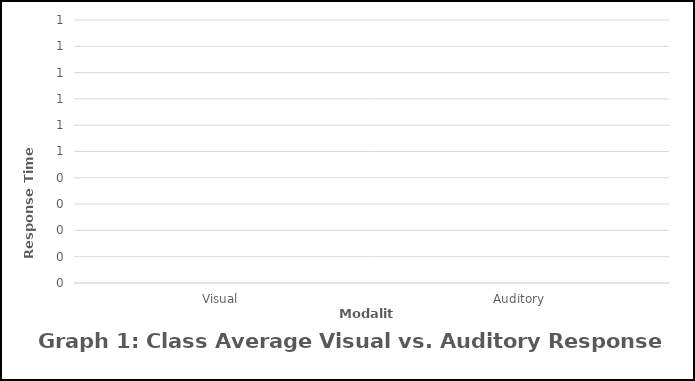
| Category | Series 0 |
|---|---|
| Visual | 0 |
| Auditory | 0 |